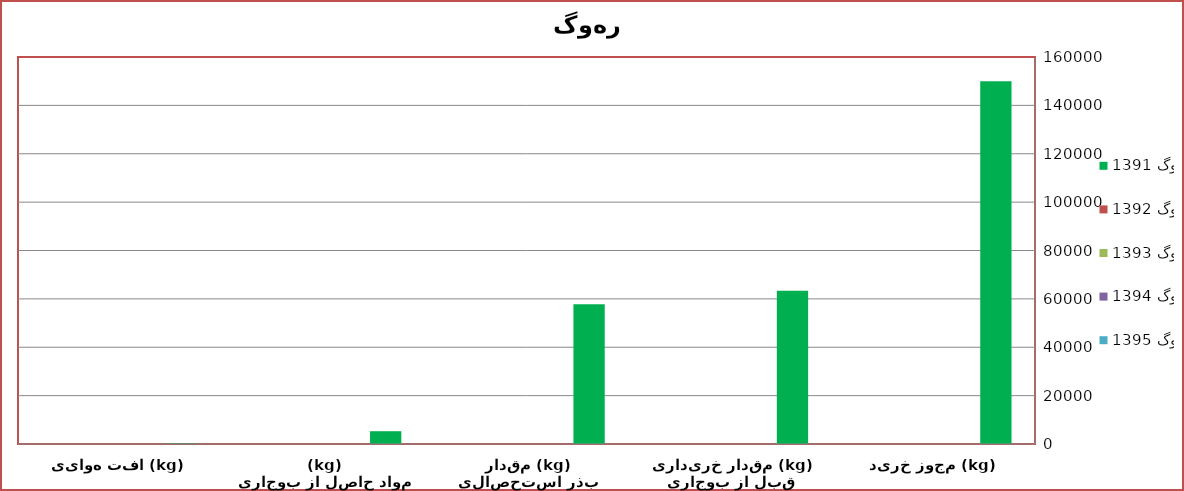
| Category | 1391 گوهر  | 1392 گوهر  | 1393 گوهر  | 1394 گوهر  | 1395 گوهر  |
|---|---|---|---|---|---|
| مجوز خرید (kg) | 150000 | 0 | 0 | 0 | 0 |
| مقدار خریداری قبل از بوجاری (kg) | 63400 | 0 | 0 | 0 | 0 |
| مقدار بذر استحصالی قابل توزیع (kg) | 57810 | 0 | 0 | 0 | 0 |
| مواد حاصل از بوجاری (kg) | 5290 | 0 | 0 | 0 | 0 |
| افت هوایی (kg) | 230 | 0 | 0 | 0 | 0 |